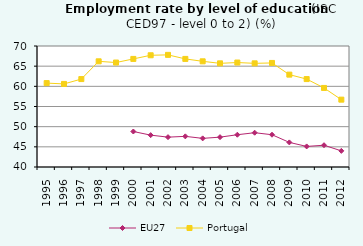
| Category | EU27 | Portugal |
|---|---|---|
| 1995.0 | 0 | 60.8 |
| 1996.0 | 0 | 60.6 |
| 1997.0 | 0 | 61.8 |
| 1998.0 | 0 | 66.2 |
| 1999.0 | 0 | 65.9 |
| 2000.0 | 48.8 | 66.8 |
| 2001.0 | 47.9 | 67.7 |
| 2002.0 | 47.4 | 67.8 |
| 2003.0 | 47.6 | 66.8 |
| 2004.0 | 47.1 | 66.2 |
| 2005.0 | 47.4 | 65.7 |
| 2006.0 | 48 | 65.9 |
| 2007.0 | 48.5 | 65.7 |
| 2008.0 | 48 | 65.8 |
| 2009.0 | 46.1 | 62.9 |
| 2010.0 | 45.1 | 61.8 |
| 2011.0 | 45.4 | 59.6 |
| 2012.0 | 44 | 56.7 |